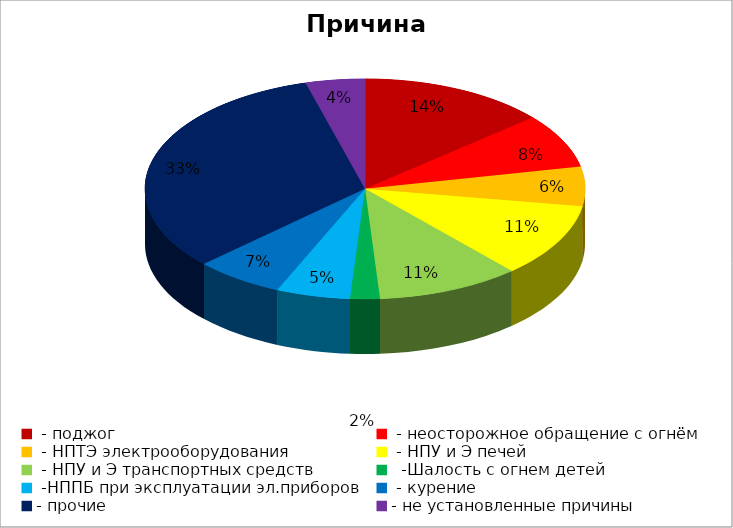
| Category | Причина пожара |
|---|---|
|  - поджог | 38 |
|  - неосторожное обращение с огнём | 22 |
|  - НПТЭ электрооборудования | 16 |
|  - НПУ и Э печей | 30 |
|  - НПУ и Э транспортных средств | 29 |
|   -Шалость с огнем детей | 6 |
|  -НППБ при эксплуатации эл.приборов | 15 |
|  - курение | 18 |
| - прочие | 90 |
| - не установленные причины | 12 |